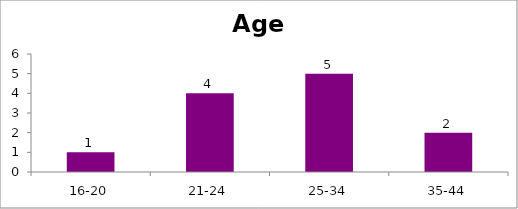
| Category | Age |
|---|---|
| 16-20 | 1 |
| 21-24 | 4 |
| 25-34 | 5 |
| 35-44 | 2 |